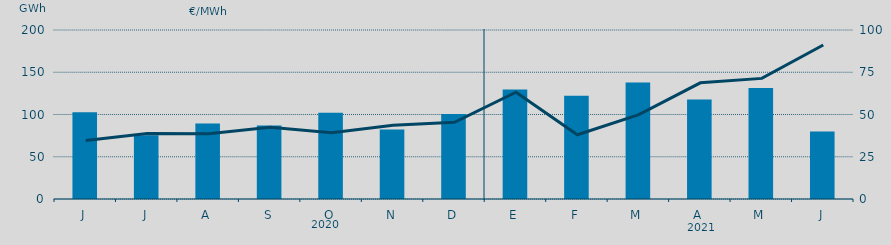
| Category | Energía a subir |
|---|---|
| J | 102.756 |
| J | 75.579 |
| A | 89.481 |
| S | 86.928 |
| O | 102.214 |
| N | 82.319 |
| D | 100.571 |
| E | 129.563 |
| F | 122.251 |
| M | 138.008 |
| A | 117.672 |
| M | 131.492 |
| J | 80.02 |